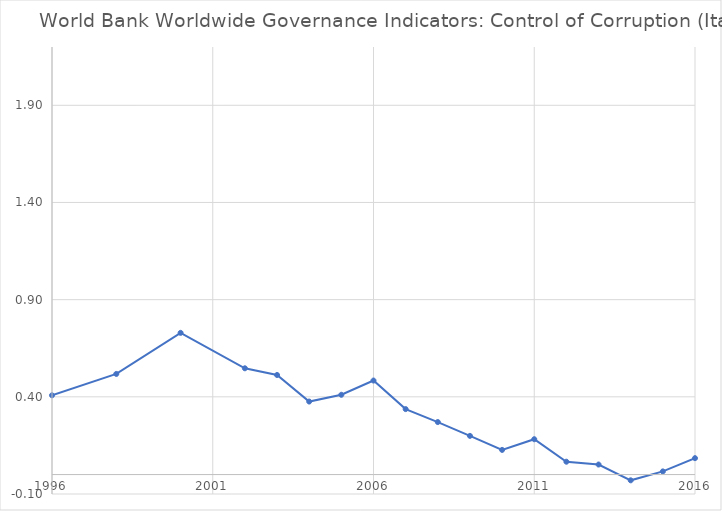
| Category | Estimate |
|---|---|
| 1996.0 | 0.408 |
| 1998.0 | 0.518 |
| 2000.0 | 0.729 |
| 2002.0 | 0.547 |
| 2003.0 | 0.512 |
| 2004.0 | 0.376 |
| 2005.0 | 0.411 |
| 2006.0 | 0.484 |
| 2007.0 | 0.337 |
| 2008.0 | 0.27 |
| 2009.0 | 0.199 |
| 2010.0 | 0.127 |
| 2011.0 | 0.182 |
| 2012.0 | 0.066 |
| 2013.0 | 0.052 |
| 2014.0 | -0.03 |
| 2015.0 | 0.016 |
| 2016.0 | 0.084 |